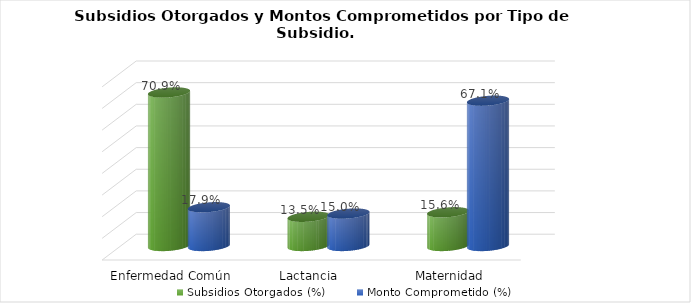
| Category | Subsidios Otorgados (%) | Monto Comprometido (%) |
|---|---|---|
| Enfermedad Común | 0.709 | 0.179 |
| Lactancia  | 0.135 | 0.15 |
| Maternidad | 0.156 | 0.671 |